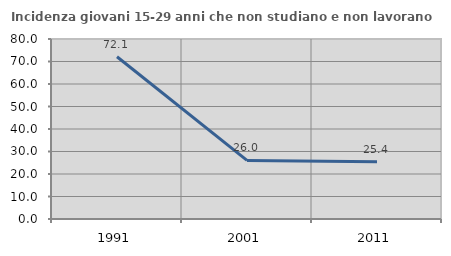
| Category | Incidenza giovani 15-29 anni che non studiano e non lavorano  |
|---|---|
| 1991.0 | 72.119 |
| 2001.0 | 26.024 |
| 2011.0 | 25.4 |